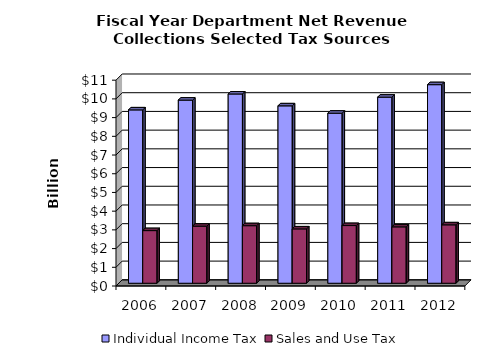
| Category | Individual Income Tax | Sales and Use Tax |
|---|---|---|
| 2006.0 | 9.265 | 2.813 |
| 2007.0 | 9.788 | 3.049 |
| 2008.0 | 10.115 | 3.076 |
| 2009.0 | 9.481 | 2.904 |
| 2010.0 | 9.088 | 3.083 |
| 2011.0 | 9.944 | 3.012 |
| 2012.0 | 10.613 | 3.122 |